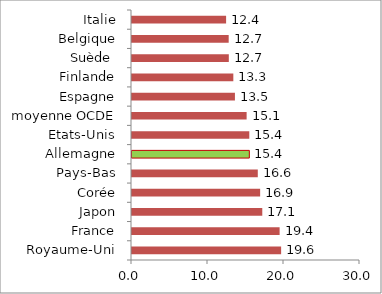
| Category | Series 0 |
|---|---|
| Royaume-Uni | 19.622 |
| France | 19.424 |
| Japon | 17.143 |
| Corée | 16.862 |
| Pays-Bas | 16.552 |
| Allemagne | 15.44 |
| Etats-Unis | 15.435 |
| moyenne OCDE | 15.082 |
| Espagne | 13.544 |
| Finlande | 13.332 |
| Suède  | 12.739 |
| Belgique | 12.723 |
| Italie | 12.382 |